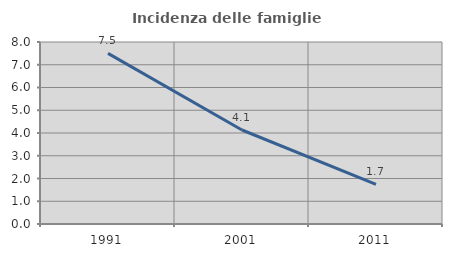
| Category | Incidenza delle famiglie numerose |
|---|---|
| 1991.0 | 7.5 |
| 2001.0 | 4.132 |
| 2011.0 | 1.739 |